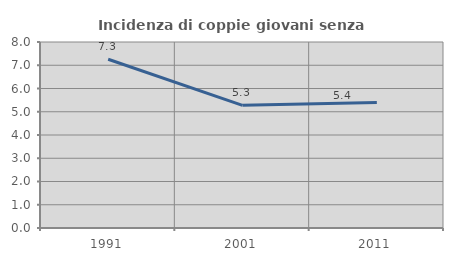
| Category | Incidenza di coppie giovani senza figli |
|---|---|
| 1991.0 | 7.256 |
| 2001.0 | 5.275 |
| 2011.0 | 5.4 |